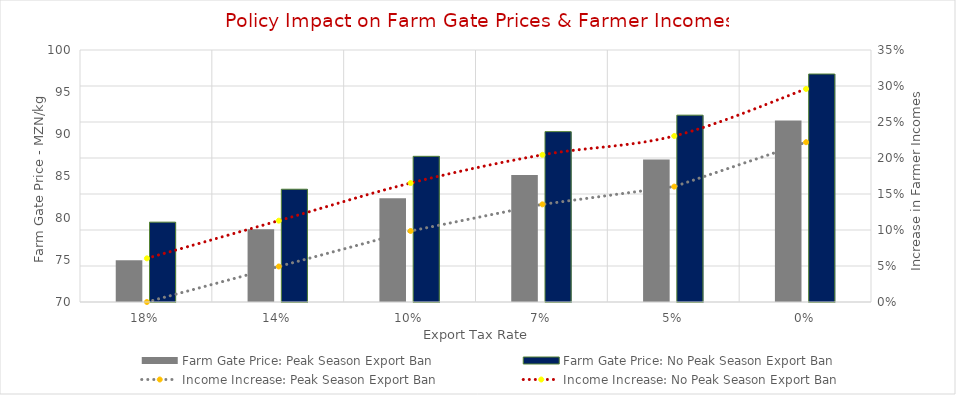
| Category | Farm Gate Price: Peak Season Export Ban | Farm Gate Price: No Peak Season Export Ban |
|---|---|---|
| 0.18 | 74.959 | 79.506 |
| 0.14 | 78.656 | 83.425 |
| 0.1 | 82.353 | 87.344 |
| 0.07 | 85.125 | 90.283 |
| 0.05 | 86.974 | 92.242 |
| 0.0 | 91.595 | 97.141 |